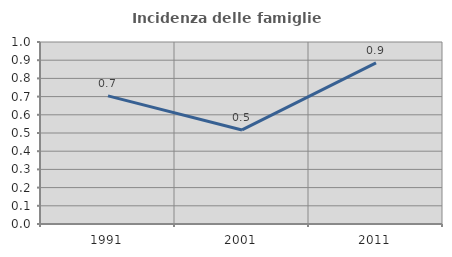
| Category | Incidenza delle famiglie numerose |
|---|---|
| 1991.0 | 0.704 |
| 2001.0 | 0.517 |
| 2011.0 | 0.885 |